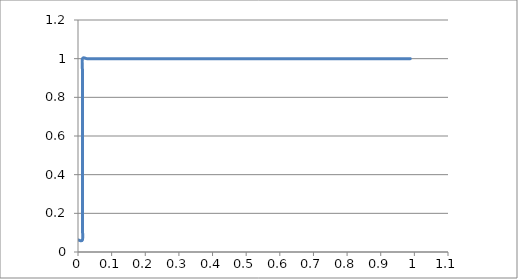
| Category | Series 0 |
|---|---|
| 0.0 | 0.062 |
| 0.013157894736842146 | 0.062 |
| 0.013157894736842146 | 0.125 |
| 0.013157894736842146 | 0.188 |
| 0.013157894736842146 | 0.25 |
| 0.013157894736842146 | 0.312 |
| 0.013157894736842146 | 0.375 |
| 0.013157894736842146 | 0.438 |
| 0.013157894736842146 | 0.5 |
| 0.013157894736842146 | 0.562 |
| 0.013157894736842146 | 0.625 |
| 0.013157894736842146 | 0.688 |
| 0.013157894736842146 | 0.75 |
| 0.013157894736842146 | 0.812 |
| 0.013157894736842146 | 0.875 |
| 0.013157894736842146 | 0.938 |
| 0.013157894736842146 | 1 |
| 0.02631578947368418 | 1 |
| 0.03947368421052633 | 1 |
| 0.052631578947368474 | 1 |
| 0.06578947368421051 | 1 |
| 0.07894736842105265 | 1 |
| 0.09210526315789469 | 1 |
| 0.10526315789473684 | 1 |
| 0.11842105263157898 | 1 |
| 0.13157894736842102 | 1 |
| 0.14473684210526316 | 1 |
| 0.1578947368421053 | 1 |
| 0.17105263157894735 | 1 |
| 0.1842105263157895 | 1 |
| 0.19736842105263153 | 1 |
| 0.21052631578947367 | 1 |
| 0.22368421052631582 | 1 |
| 0.23684210526315785 | 1 |
| 0.25 | 1 |
| 0.26315789473684215 | 1 |
| 0.2763157894736842 | 1 |
| 0.2894736842105263 | 1 |
| 0.3026315789473685 | 1 |
| 0.3157894736842105 | 1 |
| 0.32894736842105265 | 1 |
| 0.3421052631578947 | 1 |
| 0.35526315789473684 | 1 |
| 0.368421052631579 | 1 |
| 0.381578947368421 | 1 |
| 0.39473684210526316 | 1 |
| 0.4078947368421053 | 1 |
| 0.42105263157894735 | 1 |
| 0.4342105263157895 | 1 |
| 0.4473684210526315 | 1 |
| 0.4605263157894737 | 1 |
| 0.4736842105263158 | 1 |
| 0.48684210526315785 | 1 |
| 0.5 | 1 |
| 0.513157894736842 | 1 |
| 0.5263157894736843 | 1 |
| 0.5394736842105263 | 1 |
| 0.5526315789473684 | 1 |
| 0.5657894736842105 | 1 |
| 0.5789473684210527 | 1 |
| 0.5921052631578947 | 1 |
| 0.6052631578947368 | 1 |
| 0.618421052631579 | 1 |
| 0.631578947368421 | 1 |
| 0.6447368421052632 | 1 |
| 0.6578947368421053 | 1 |
| 0.6710526315789473 | 1 |
| 0.6842105263157895 | 1 |
| 0.6973684210526316 | 1 |
| 0.7105263157894737 | 1 |
| 0.7236842105263157 | 1 |
| 0.736842105263158 | 1 |
| 0.75 | 1 |
| 0.7631578947368421 | 1 |
| 0.7763157894736842 | 1 |
| 0.7894736842105263 | 1 |
| 0.8026315789473684 | 1 |
| 0.8157894736842105 | 1 |
| 0.8289473684210527 | 1 |
| 0.8421052631578947 | 1 |
| 0.8552631578947368 | 1 |
| 0.868421052631579 | 1 |
| 0.881578947368421 | 1 |
| 0.8947368421052632 | 1 |
| 0.9078947368421053 | 1 |
| 0.9210526315789473 | 1 |
| 0.9342105263157895 | 1 |
| 0.9473684210526316 | 1 |
| 0.9605263157894737 | 1 |
| 0.9736842105263158 | 1 |
| 0.9868421052631579 | 1 |
| 0.9868421052631579 | 1 |